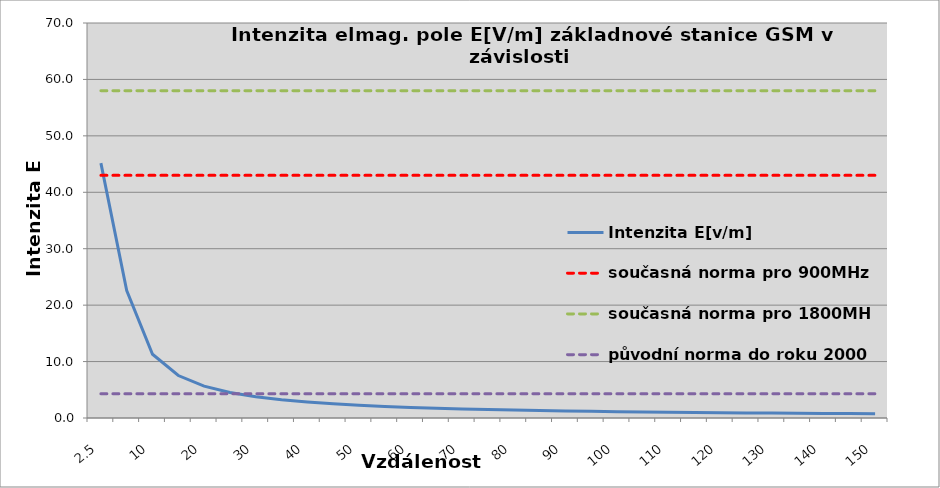
| Category | Intenzita E[v/m] | současná norma pro 900MHz | současná norma pro 1800MHz | původní norma do roku 2000 |
|---|---|---|---|---|
| 2.5 | 45.166 | 43 | 58 | 4.3 |
| 5.0 | 22.583 | 43 | 58 | 4.3 |
| 10.0 | 11.292 | 43 | 58 | 4.3 |
| 15.0 | 7.528 | 43 | 58 | 4.3 |
| 20.0 | 5.646 | 43 | 58 | 4.3 |
| 25.0 | 4.517 | 43 | 58 | 4.3 |
| 30.0 | 3.764 | 43 | 58 | 4.3 |
| 35.0 | 3.226 | 43 | 58 | 4.3 |
| 40.0 | 2.823 | 43 | 58 | 4.3 |
| 45.0 | 2.509 | 43 | 58 | 4.3 |
| 50.0 | 2.258 | 43 | 58 | 4.3 |
| 55.0 | 2.053 | 43 | 58 | 4.3 |
| 60.0 | 1.882 | 43 | 58 | 4.3 |
| 65.0 | 1.737 | 43 | 58 | 4.3 |
| 70.0 | 1.613 | 43 | 58 | 4.3 |
| 75.0 | 1.506 | 43 | 58 | 4.3 |
| 80.0 | 1.411 | 43 | 58 | 4.3 |
| 85.0 | 1.328 | 43 | 58 | 4.3 |
| 90.0 | 1.255 | 43 | 58 | 4.3 |
| 95.0 | 1.189 | 43 | 58 | 4.3 |
| 100.0 | 1.129 | 43 | 58 | 4.3 |
| 105.0 | 1.075 | 43 | 58 | 4.3 |
| 110.0 | 1.027 | 43 | 58 | 4.3 |
| 115.0 | 0.982 | 43 | 58 | 4.3 |
| 120.0 | 0.941 | 43 | 58 | 4.3 |
| 125.0 | 0.903 | 43 | 58 | 4.3 |
| 130.0 | 0.869 | 43 | 58 | 4.3 |
| 135.0 | 0.836 | 43 | 58 | 4.3 |
| 140.0 | 0.807 | 43 | 58 | 4.3 |
| 145.0 | 0.779 | 43 | 58 | 4.3 |
| 150.0 | 0.753 | 43 | 58 | 4.3 |